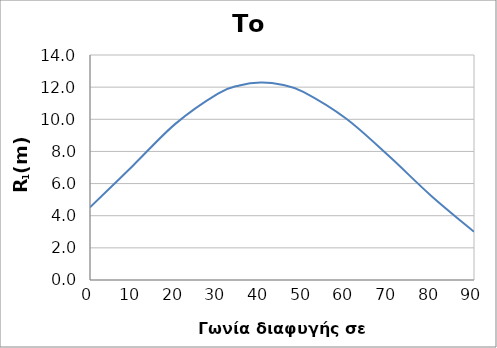
| Category | Series 0 |
|---|---|
| 0.0 | 4.518 |
| 10.0 | 7.098 |
| 20.0 | 9.715 |
| 30.0 | 11.598 |
| 35.0 | 12.107 |
| 40.0 | 12.291 |
| 45.0 | 12.15 |
| 50.0 | 11.704 |
| 60.0 | 10.046 |
| 70.0 | 7.727 |
| 80.0 | 5.232 |
| 90.0 | 3 |